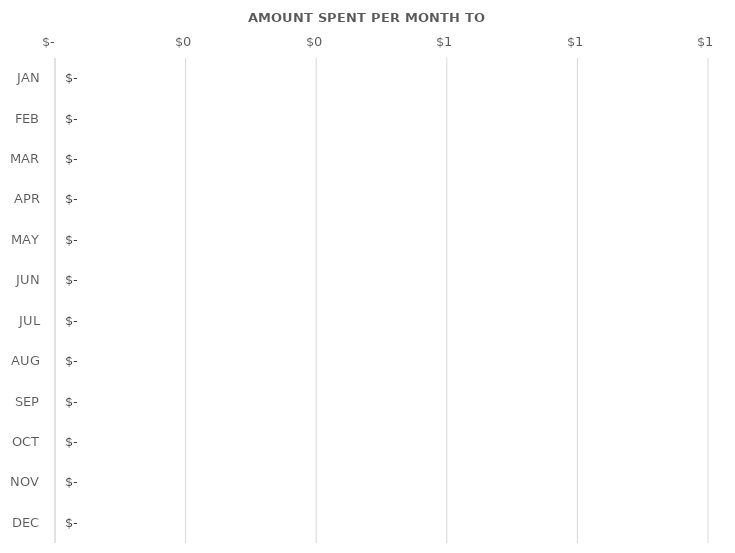
| Category | Series 0 |
|---|---|
| JAN | 0 |
| FEB | 0 |
| MAR | 0 |
| APR | 0 |
| MAY | 0 |
| JUN | 0 |
| JUL | 0 |
| AUG | 0 |
| SEP | 0 |
| OCT | 0 |
| NOV | 0 |
| DEC | 0 |